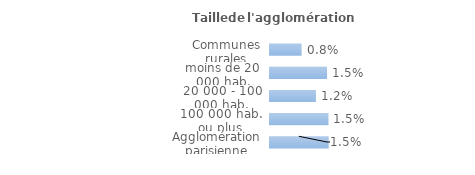
| Category | Series 0 |
|---|---|
| Communes rurales | 0.008 |
| moins de 20 000 hab. | 0.015 |
| 20 000 - 100 000 hab. | 0.012 |
| 100 000 hab. ou plus | 0.015 |
| Agglomération parisienne | 0.015 |